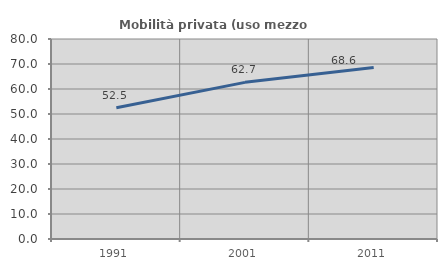
| Category | Mobilità privata (uso mezzo privato) |
|---|---|
| 1991.0 | 52.487 |
| 2001.0 | 62.654 |
| 2011.0 | 68.607 |